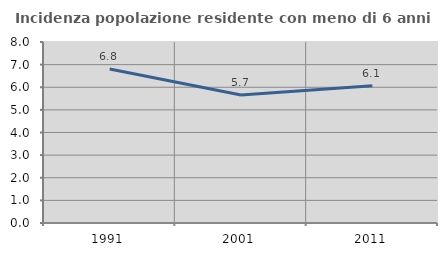
| Category | Incidenza popolazione residente con meno di 6 anni |
|---|---|
| 1991.0 | 6.805 |
| 2001.0 | 5.657 |
| 2011.0 | 6.066 |